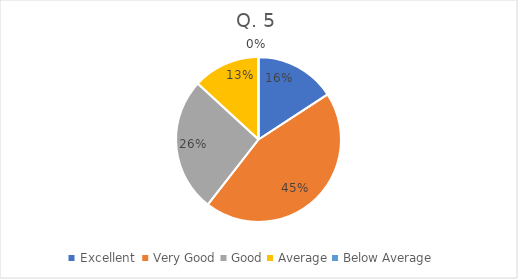
| Category | Series 0 |
|---|---|
| Excellent  | 6 |
| Very Good | 17 |
| Good | 10 |
| Average | 5 |
| Below Average | 0 |